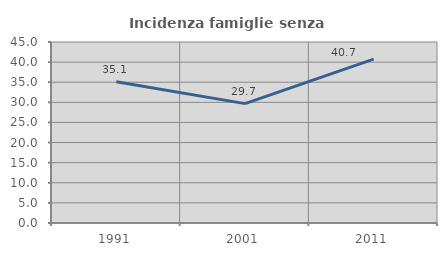
| Category | Incidenza famiglie senza nuclei |
|---|---|
| 1991.0 | 35.115 |
| 2001.0 | 29.675 |
| 2011.0 | 40.727 |